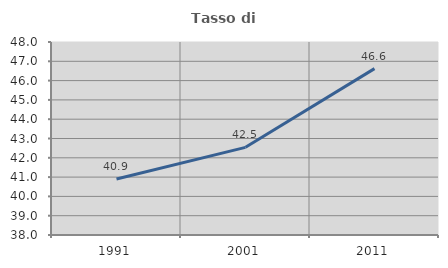
| Category | Tasso di occupazione   |
|---|---|
| 1991.0 | 40.903 |
| 2001.0 | 42.542 |
| 2011.0 | 46.619 |